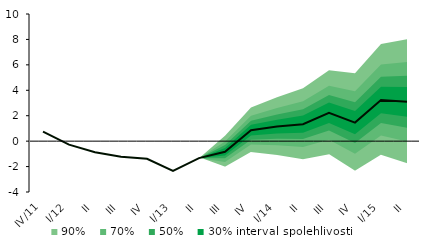
| Category | Centerline |
|---|---|
| IV/11 | 0.754 |
| I/12 | -0.273 |
| II | -0.871 |
| III | -1.222 |
| IV | -1.389 |
| I/13 | -2.343 |
| II | -1.338 |
| III | -0.832 |
| IV | 0.859 |
| I/14 | 1.143 |
| II | 1.335 |
| III | 2.232 |
| IV | 1.458 |
| I/15 | 3.241 |
| II | 3.095 |